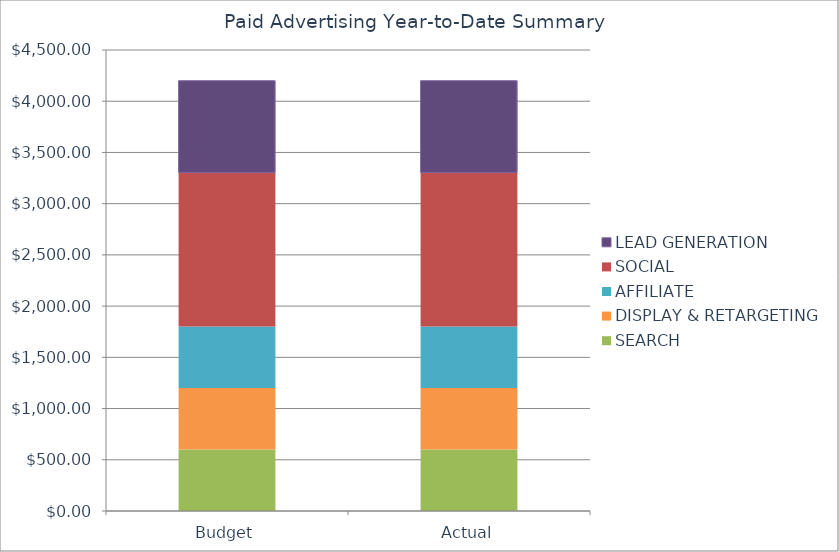
| Category | SEARCH | DISPLAY & RETARGETING | AFFILIATE | SOCIAL | LEAD GENERATION |
|---|---|---|---|---|---|
| Budget | 600 | 600 | 600 | 1500 | 900 |
| Actual | 600 | 600 | 600 | 1500 | 900 |